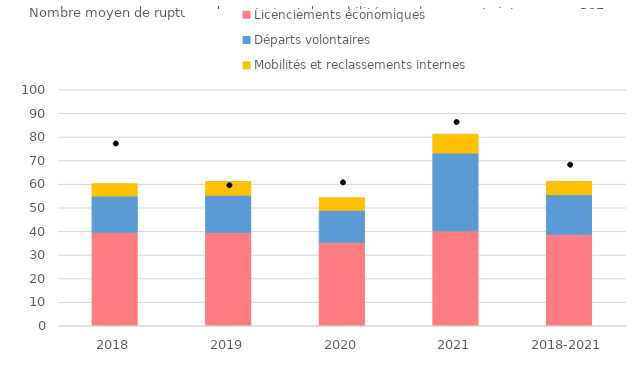
| Category | Licenciements économiques | Départs volontaires | Mobilités et reclassements internes |
|---|---|---|---|
| 2018 | 39.63 | 15.308 | 5.317 |
| 2019 | 39.552 | 15.753 | 5.885 |
| 2020 | 35.282 | 13.648 | 5.404 |
| 2021 | 40.147 | 33.047 | 8.084 |
| 2018-2021 | 38.692 | 16.775 | 5.797 |